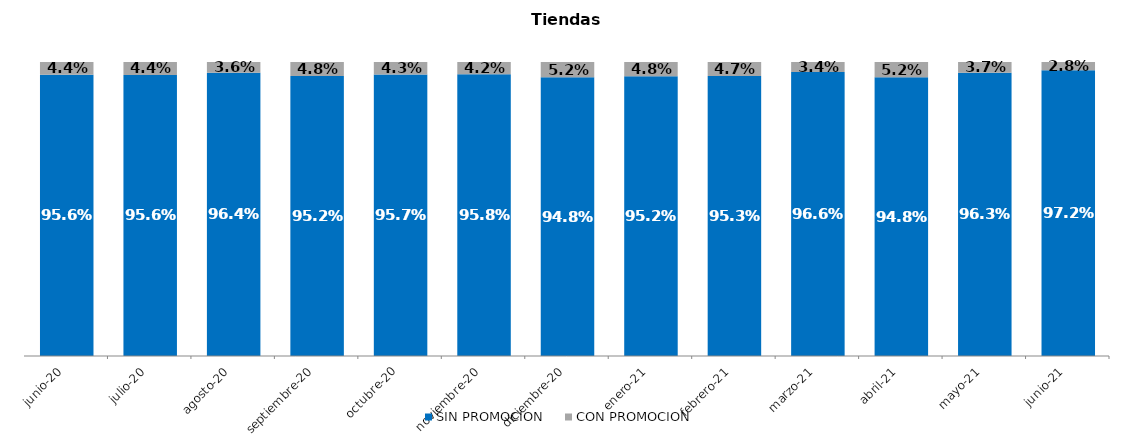
| Category | SIN PROMOCION   | CON PROMOCION   |
|---|---|---|
| 2020-06-01 | 0.956 | 0.044 |
| 2020-07-01 | 0.956 | 0.044 |
| 2020-08-01 | 0.964 | 0.036 |
| 2020-09-01 | 0.952 | 0.048 |
| 2020-10-01 | 0.957 | 0.043 |
| 2020-11-01 | 0.958 | 0.042 |
| 2020-12-01 | 0.948 | 0.052 |
| 2021-01-01 | 0.952 | 0.048 |
| 2021-02-01 | 0.953 | 0.047 |
| 2021-03-01 | 0.966 | 0.034 |
| 2021-04-01 | 0.948 | 0.052 |
| 2021-05-01 | 0.963 | 0.037 |
| 2021-06-01 | 0.972 | 0.028 |